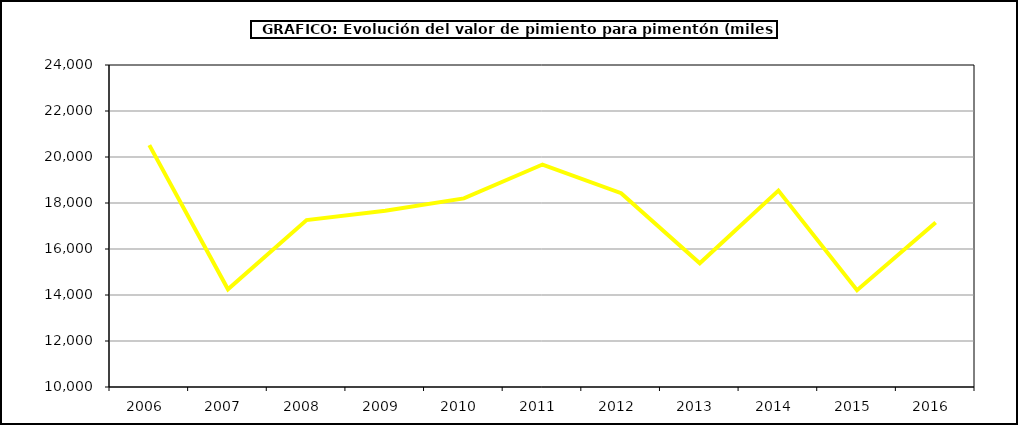
| Category | Valor |
|---|---|
| 2006.0 | 20516.405 |
| 2007.0 | 14247.039 |
| 2008.0 | 17258.828 |
| 2009.0 | 17665.33 |
| 2010.0 | 18201.072 |
| 2011.0 | 19672.3 |
| 2012.0 | 18426.65 |
| 2013.0 | 15378.158 |
| 2014.0 | 18538.464 |
| 2015.0 | 14208 |
| 2016.0 | 17155 |